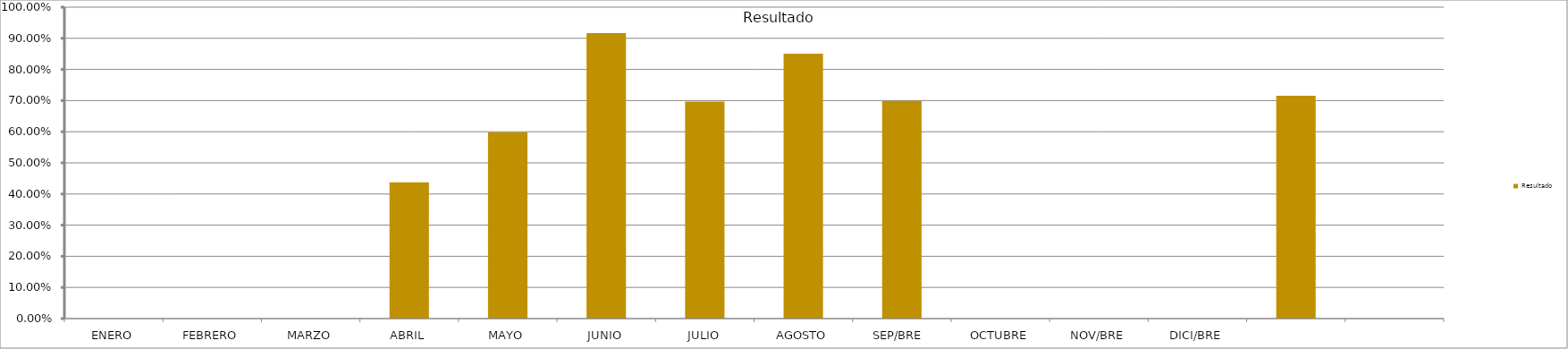
| Category | Resultado  |
|---|---|
| ENERO | 0 |
| FEBRERO | 0 |
| MARZO | 0 |
| ABRIL | 0.437 |
| MAYO | 0.599 |
| JUNIO | 0.917 |
| JULIO | 0.697 |
| AGOSTO | 0.851 |
| SEP/BRE  | 0.699 |
| OCTUBRE | 0 |
| NOV/BRE | 0 |
| DICI/BRE | 0 |